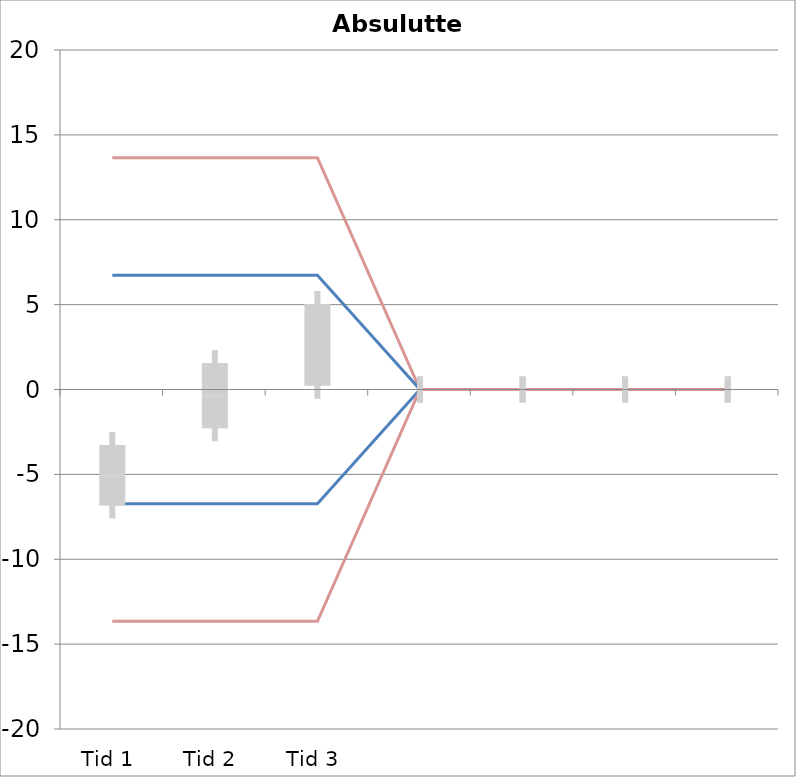
| Category | 1 | 2 | 3 | 4 | 5 | 6 | 7 | 8 | 9 | 10 | 11 | 12 | 13 | 14 | 15 | 16 | 17 | 18 | 19 | 20 | TEa | B | -B | -TEa | M |
|---|---|---|---|---|---|---|---|---|---|---|---|---|---|---|---|---|---|---|---|---|---|---|---|---|---|
| Tid 1 | -3.8 | -2.3 | -6.3 | -6.2 | -6.6 | -2.5 | -4.9 | -1.1 | -12.8 | -2.2 | -4.1 | -4.6 | -4.2 | -11 | -3.2 | 0 | 0 | 0 | 0 | 0 | 13.653 | 6.729 | -6.729 | -13.653 | -5.053 |
| Tid 2 | 0.2 | 0.6 | -3.3 | 1.5 | 3.1 | 3.9 | 1.9 | 0.4 | 3.6 | 0.1 | -0.4 | -2.3 | -2.6 | -9.9 | -2.3 | 0 | 0 | 0 | 0 | 0 | 13.653 | 6.729 | -6.729 | -13.653 | -0.367 |
| Tid 3 | 1.8 | 4.7 | -1.2 | -0.8 | 6.9 | 10.5 | 3.4 | 4.7 | 10.9 | 0.3 | -1.8 | -0.6 | -0.7 | -2.9 | 4.2 | 0 | 0 | 0 | 0 | 0 | 13.653 | 6.729 | -6.729 | -13.653 | 2.627 |